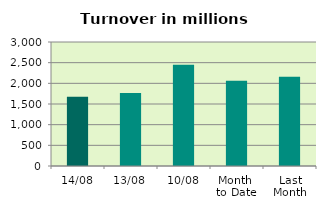
| Category | Series 0 |
|---|---|
| 14/08 | 1673.789 |
| 13/08 | 1768.275 |
| 10/08 | 2450.701 |
| Month 
to Date | 2060.918 |
| Last
Month | 2159.874 |